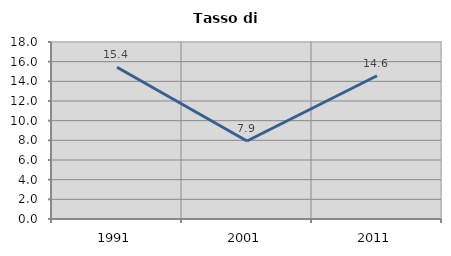
| Category | Tasso di disoccupazione   |
|---|---|
| 1991.0 | 15.434 |
| 2001.0 | 7.931 |
| 2011.0 | 14.57 |